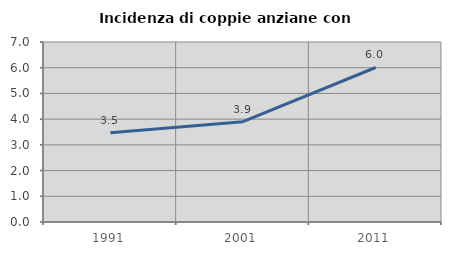
| Category | Incidenza di coppie anziane con figli |
|---|---|
| 1991.0 | 3.467 |
| 2001.0 | 3.902 |
| 2011.0 | 6.009 |